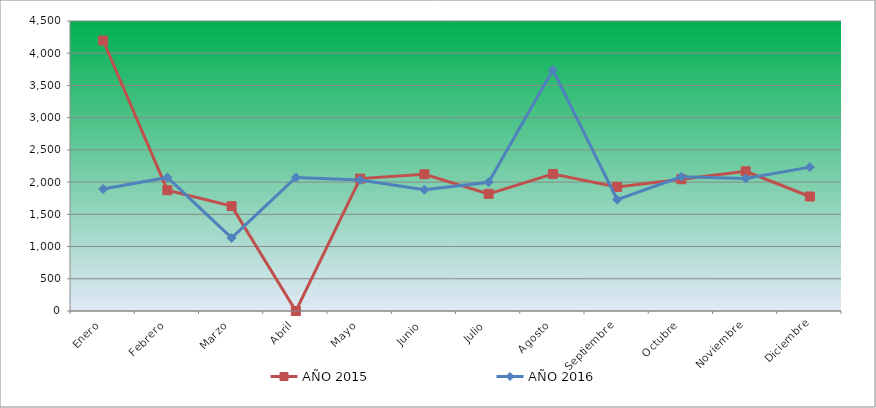
| Category | AÑO 2015 | AÑO 2016 |
|---|---|---|
| Enero | 4197.111 | 1892.95 |
| Febrero | 1874.538 | 2072.755 |
| Marzo | 1627.346 | 1133.772 |
| Abril | 0 | 2072.755 |
| Mayo | 2054.782 | 2032.798 |
| Junio | 2121.73 | 1882.961 |
| Julio | 1817.89 | 1997.836 |
| Agosto | 2126.88 | 3740.948 |
| Septiembre | 1926.036 | 1728.128 |
| Octubre | 2044.482 | 2082.744 |
| Noviembre | 2168.078 | 2057.771 |
| Diciembre | 1776.691 | 2232.582 |